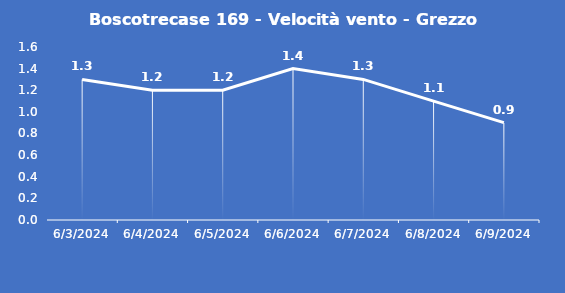
| Category | Boscotrecase 169 - Velocità vento - Grezzo (m/s) |
|---|---|
| 6/3/24 | 1.3 |
| 6/4/24 | 1.2 |
| 6/5/24 | 1.2 |
| 6/6/24 | 1.4 |
| 6/7/24 | 1.3 |
| 6/8/24 | 1.1 |
| 6/9/24 | 0.9 |